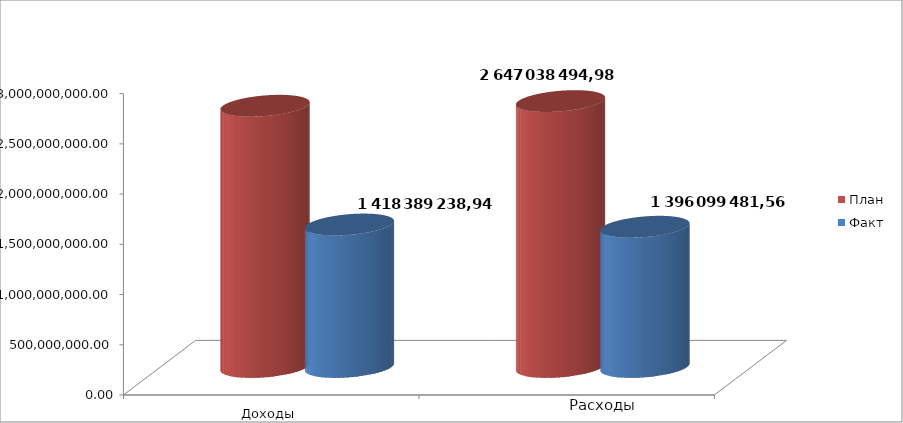
| Category | План | Факт |
|---|---|---|
| 0 | 2600547077.03 | 1418389238.94 |
| 1 | 2647038494.98 | 1396099481.56 |